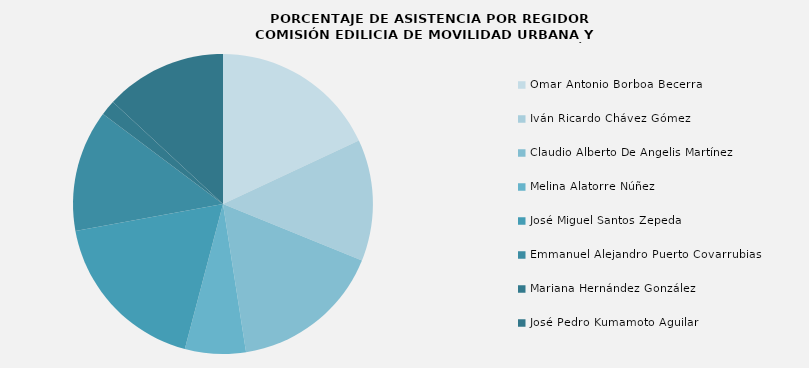
| Category | Series 0 |
|---|---|
| Omar Antonio Borboa Becerra | 100 |
| Iván Ricardo Chávez Gómez | 72.727 |
| Claudio Alberto De Angelis Martínez | 90.909 |
| Melina Alatorre Núñez | 36.364 |
| José Miguel Santos Zepeda | 100 |
| Emmanuel Alejandro Puerto Covarrubias | 72.727 |
| Mariana Hernández González | 9.091 |
| José Pedro Kumamoto Aguilar | 72.727 |